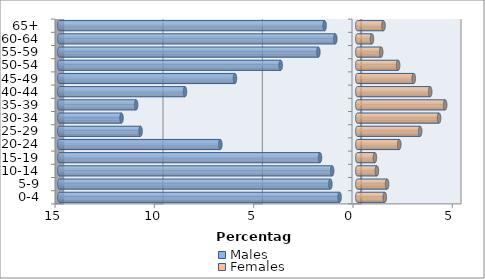
| Category | Males | Females |
|---|---|---|
| 0-4 | -0.894 | 1.383 |
| 5-9 | -1.358 | 1.498 |
| 10-14 | -1.267 | 0.985 |
| 15-19 | -1.879 | 0.886 |
| 20-24 | -6.896 | 2.111 |
| 25-29 | -10.911 | 3.163 |
| 30-34 | -11.872 | 4.115 |
| 35-39 | -11.135 | 4.421 |
| 40-44 | -8.676 | 3.668 |
| 45-49 | -6.159 | 2.84 |
| 50-54 | -3.858 | 2.053 |
| 55-59 | -1.962 | 1.2 |
| 60-64 | -1.109 | 0.737 |
| 65+ | -1.647 | 1.316 |